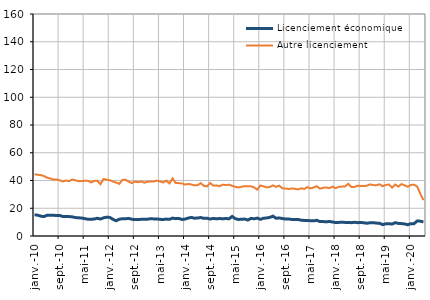
| Category | Licenciement économique | Autre licenciement |
|---|---|---|
| 2010-01-01 | 15.3 | 44.5 |
| 2010-02-01 | 15 | 44.1 |
| 2010-03-01 | 14.3 | 43.9 |
| 2010-04-01 | 14 | 43.2 |
| 2010-05-01 | 15 | 42 |
| 2010-06-01 | 15 | 41.5 |
| 2010-07-01 | 15 | 40.7 |
| 2010-08-01 | 14.7 | 40.7 |
| 2010-09-01 | 14.8 | 40.2 |
| 2010-10-01 | 14.1 | 39.3 |
| 2010-11-01 | 14 | 40 |
| 2010-12-01 | 14 | 39.5 |
| 2011-01-01 | 13.8 | 40.7 |
| 2011-02-01 | 13.3 | 40.2 |
| 2011-03-01 | 13.1 | 39.5 |
| 2011-04-01 | 13 | 39.6 |
| 2011-05-01 | 12.5 | 39.8 |
| 2011-06-01 | 12.1 | 39.8 |
| 2011-07-01 | 12.1 | 38.6 |
| 2011-08-01 | 12.2 | 39.7 |
| 2011-09-01 | 12.8 | 39.8 |
| 2011-10-01 | 12.2 | 37.3 |
| 2011-11-01 | 13.1 | 41.1 |
| 2011-12-01 | 13.6 | 40.6 |
| 2012-01-01 | 13.4 | 40.2 |
| 2012-02-01 | 12 | 39.2 |
| 2012-03-01 | 11 | 38.5 |
| 2012-04-01 | 12.1 | 37.6 |
| 2012-05-01 | 12.4 | 40.4 |
| 2012-06-01 | 12.4 | 40.6 |
| 2012-07-01 | 12.7 | 39.2 |
| 2012-08-01 | 12.1 | 38.1 |
| 2012-09-01 | 11.8 | 39.2 |
| 2012-10-01 | 11.9 | 38.8 |
| 2012-11-01 | 12 | 39.3 |
| 2012-12-01 | 12.1 | 38.4 |
| 2013-01-01 | 12.1 | 39.1 |
| 2013-02-01 | 12.5 | 39.3 |
| 2013-03-01 | 12.3 | 39.3 |
| 2013-04-01 | 12.3 | 39.9 |
| 2013-05-01 | 12 | 39.3 |
| 2013-06-01 | 11.9 | 38.6 |
| 2013-07-01 | 12.2 | 39.9 |
| 2013-08-01 | 12 | 37.9 |
| 2013-09-01 | 12.9 | 41.5 |
| 2013-10-01 | 12.5 | 38.2 |
| 2013-11-01 | 12.7 | 38.1 |
| 2013-12-01 | 11.9 | 37.9 |
| 2014-01-01 | 12.2 | 37.1 |
| 2014-02-01 | 12.9 | 37.5 |
| 2014-03-01 | 13.4 | 37.1 |
| 2014-04-01 | 12.8 | 36.5 |
| 2014-05-01 | 13 | 36.6 |
| 2014-06-01 | 13.3 | 38.1 |
| 2014-07-01 | 12.7 | 36.1 |
| 2014-08-01 | 12.8 | 35.8 |
| 2014-09-01 | 12.2 | 38.2 |
| 2014-10-01 | 12.7 | 36.3 |
| 2014-11-01 | 12.4 | 36.5 |
| 2014-12-01 | 12.6 | 35.9 |
| 2015-01-01 | 12.4 | 37 |
| 2015-02-01 | 12.6 | 36.7 |
| 2015-03-01 | 12.4 | 37 |
| 2015-04-01 | 14.1 | 36.2 |
| 2015-05-01 | 12.5 | 35.4 |
| 2015-06-01 | 11.9 | 35 |
| 2015-07-01 | 12.1 | 35.5 |
| 2015-08-01 | 12.2 | 35.9 |
| 2015-09-01 | 11.5 | 35.9 |
| 2015-10-01 | 12.7 | 35.8 |
| 2015-11-01 | 12.4 | 35 |
| 2015-12-01 | 12.9 | 33.4 |
| 2016-01-01 | 12 | 36.4 |
| 2016-02-01 | 12.8 | 35.8 |
| 2016-03-01 | 13 | 35.1 |
| 2016-04-01 | 13.4 | 35.3 |
| 2016-05-01 | 14.3 | 36.5 |
| 2016-06-01 | 12.8 | 35.4 |
| 2016-07-01 | 13 | 36.3 |
| 2016-08-01 | 12.6 | 34.4 |
| 2016-09-01 | 12.2 | 34.2 |
| 2016-10-01 | 12.3 | 33.9 |
| 2016-11-01 | 11.9 | 34.2 |
| 2016-12-01 | 11.9 | 34.1 |
| 2017-01-01 | 11.9 | 33.6 |
| 2017-02-01 | 11.4 | 34.4 |
| 2017-03-01 | 11.2 | 33.9 |
| 2017-04-01 | 11.2 | 35.2 |
| 2017-05-01 | 11 | 34.3 |
| 2017-06-01 | 10.9 | 35 |
| 2017-07-01 | 11.3 | 35.9 |
| 2017-08-01 | 10.4 | 34.1 |
| 2017-09-01 | 10.4 | 34.7 |
| 2017-10-01 | 10.2 | 35 |
| 2017-11-01 | 10.5 | 34.5 |
| 2017-12-01 | 10.1 | 35.6 |
| 2018-01-01 | 9.7 | 34.5 |
| 2018-02-01 | 9.8 | 35.4 |
| 2018-03-01 | 9.9 | 35.6 |
| 2018-04-01 | 9.8 | 35.7 |
| 2018-05-01 | 9.8 | 37.6 |
| 2018-06-01 | 9.6 | 35.4 |
| 2018-07-01 | 9.9 | 35.4 |
| 2018-08-01 | 9.6 | 36.2 |
| 2018-09-01 | 9.8 | 36.1 |
| 2018-10-01 | 9.5 | 36 |
| 2018-11-01 | 9.2 | 36.3 |
| 2018-12-01 | 9.6 | 37.2 |
| 2019-01-01 | 9.6 | 36.7 |
| 2019-02-01 | 9.3 | 36.6 |
| 2019-03-01 | 9.2 | 37.3 |
| 2019-04-01 | 8.2 | 35.9 |
| 2019-05-01 | 8.8 | 36.8 |
| 2019-06-01 | 8.9 | 37.1 |
| 2019-07-01 | 8.6 | 34.9 |
| 2019-08-01 | 9.6 | 37.1 |
| 2019-09-01 | 9.1 | 35.6 |
| 2019-10-01 | 8.9 | 37.4 |
| 2019-11-01 | 8.7 | 36.5 |
| 2019-12-01 | 8.1 | 35.5 |
| 2020-01-01 | 8.9 | 36.8 |
| 2020-02-01 | 8.9 | 37 |
| 2020-03-01 | 10.8 | 35.7 |
| 2020-04-01 | 10.7 | 30.5 |
| 2020-05-01 | 10.1 | 25.8 |